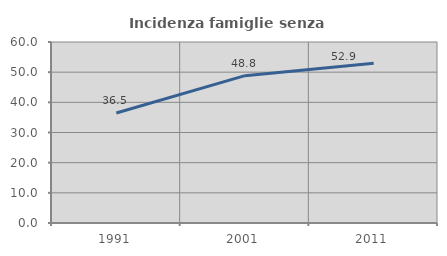
| Category | Incidenza famiglie senza nuclei |
|---|---|
| 1991.0 | 36.471 |
| 2001.0 | 48.837 |
| 2011.0 | 52.941 |